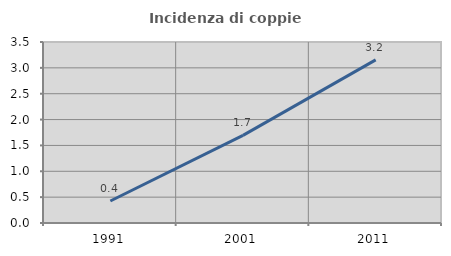
| Category | Incidenza di coppie miste |
|---|---|
| 1991.0 | 0.425 |
| 2001.0 | 1.695 |
| 2011.0 | 3.155 |